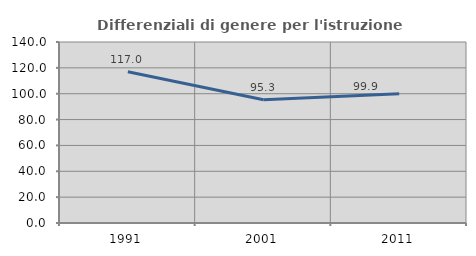
| Category | Differenziali di genere per l'istruzione superiore |
|---|---|
| 1991.0 | 116.972 |
| 2001.0 | 95.283 |
| 2011.0 | 99.927 |